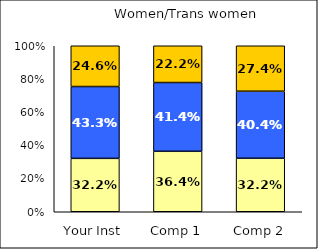
| Category | Low Social Agency | Average Social Agency | High Social Agency |
|---|---|---|---|
| Your Inst | 0.322 | 0.433 | 0.246 |
| Comp 1 | 0.364 | 0.414 | 0.222 |
| Comp 2 | 0.322 | 0.404 | 0.274 |